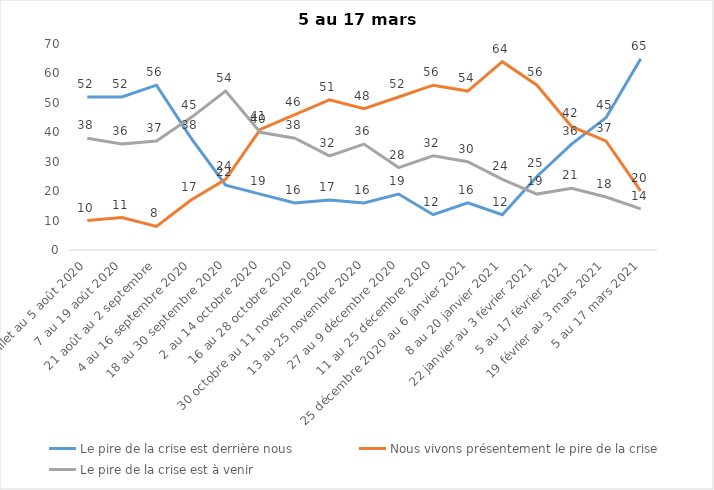
| Category | Le pire de la crise est derrière nous | Nous vivons présentement le pire de la crise | Le pire de la crise est à venir |
|---|---|---|---|
| 24 juillet au 5 août 2020 | 52 | 10 | 38 |
| 7 au 19 août 2020 | 52 | 11 | 36 |
| 21 août au 2 septembre | 56 | 8 | 37 |
| 4 au 16 septembre 2020 | 38 | 17 | 45 |
| 18 au 30 septembre 2020 | 22 | 24 | 54 |
| 2 au 14 octobre 2020 | 19 | 41 | 40 |
| 16 au 28 octobre 2020 | 16 | 46 | 38 |
| 30 octobre au 11 novembre 2020 | 17 | 51 | 32 |
| 13 au 25 novembre 2020 | 16 | 48 | 36 |
| 27 au 9 décembre 2020 | 19 | 52 | 28 |
| 11 au 25 décembre 2020 | 12 | 56 | 32 |
| 25 décembre 2020 au 6 janvier 2021 | 16 | 54 | 30 |
| 8 au 20 janvier 2021 | 12 | 64 | 24 |
| 22 janvier au 3 février 2021 | 25 | 56 | 19 |
| 5 au 17 février 2021 | 36 | 42 | 21 |
| 19 février au 3 mars 2021 | 45 | 37 | 18 |
| 5 au 17 mars 2021 | 65 | 20 | 14 |